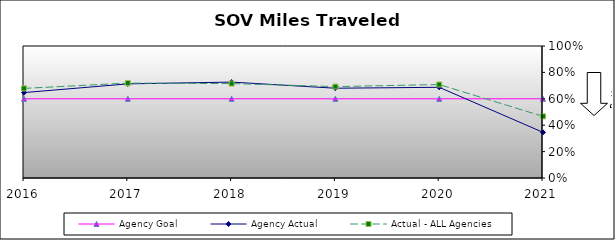
| Category | Agency Goal | Agency Actual | Actual - ALL Agencies |
|---|---|---|---|
| 2016.0 | 0.6 | 0.647 | 0.679 |
| 2017.0 | 0.6 | 0.713 | 0.719 |
| 2018.0 | 0.6 | 0.727 | 0.715 |
| 2019.0 | 0.6 | 0.68 | 0.692 |
| 2020.0 | 0.6 | 0.687 | 0.708 |
| 2021.0 | 0.6 | 0.346 | 0.467 |